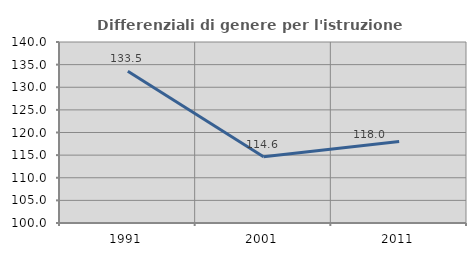
| Category | Differenziali di genere per l'istruzione superiore |
|---|---|
| 1991.0 | 133.522 |
| 2001.0 | 114.628 |
| 2011.0 | 117.989 |